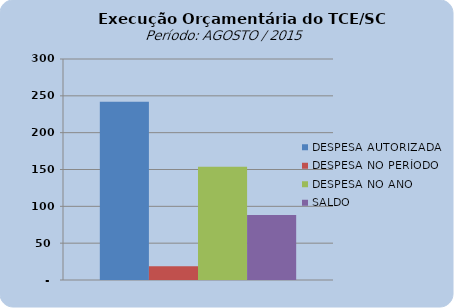
| Category | DESPESA AUTORIZADA | DESPESA NO PERÍODO | DESPESA NO ANO | SALDO |
|---|---|---|---|---|
| 0 | 242002809.33 | 18523811.81 | 153879043.69 | 88123765.64 |